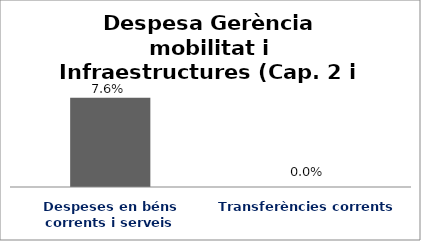
| Category | Series 0 |
|---|---|
| Despeses en béns corrents i serveis | 0.076 |
| Transferències corrents | 0 |